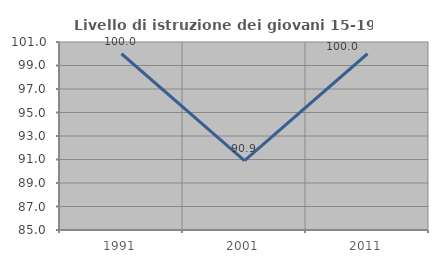
| Category | Livello di istruzione dei giovani 15-19 anni |
|---|---|
| 1991.0 | 100 |
| 2001.0 | 90.909 |
| 2011.0 | 100 |